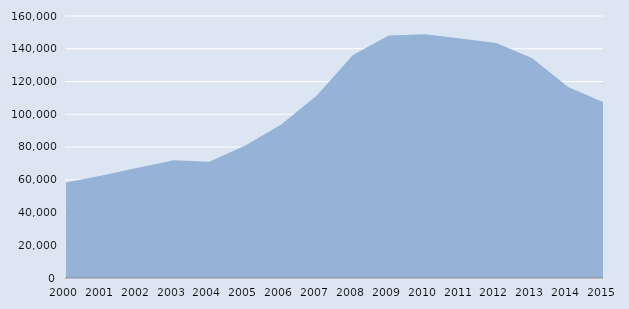
| Category | Series 0 |
|---|---|
| 2000.0 | 58364 |
| 2001.0 | 62610 |
| 2002.0 | 67313 |
| 2003.0 | 71843 |
| 2004.0 | 71065 |
| 2005.0 | 80846 |
| 2006.0 | 93767 |
| 2007.0 | 111575 |
| 2008.0 | 136171 |
| 2009.0 | 148154 |
| 2010.0 | 148789 |
| 2011.0 | 146298 |
| 2012.0 | 143488 |
| 2013.0 | 134248 |
| 2014.0 | 116710 |
| 2015.0 | 107226 |